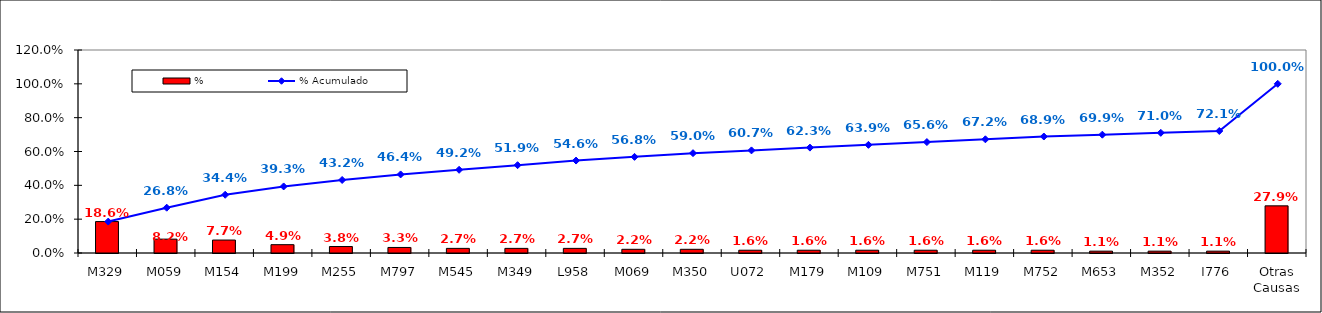
| Category | % |
|---|---|
| M329 | 0.186 |
| M059 | 0.082 |
| M154 | 0.077 |
| M199 | 0.049 |
| M255 | 0.038 |
| M797 | 0.033 |
| M545 | 0.027 |
| M349 | 0.027 |
| L958 | 0.027 |
| M069 | 0.022 |
| M350 | 0.022 |
| U072 | 0.016 |
| M179 | 0.016 |
| M109 | 0.016 |
| M751 | 0.016 |
| M119 | 0.016 |
| M752 | 0.016 |
| M653 | 0.011 |
| M352 | 0.011 |
| I776 | 0.011 |
| Otras Causas | 0.279 |